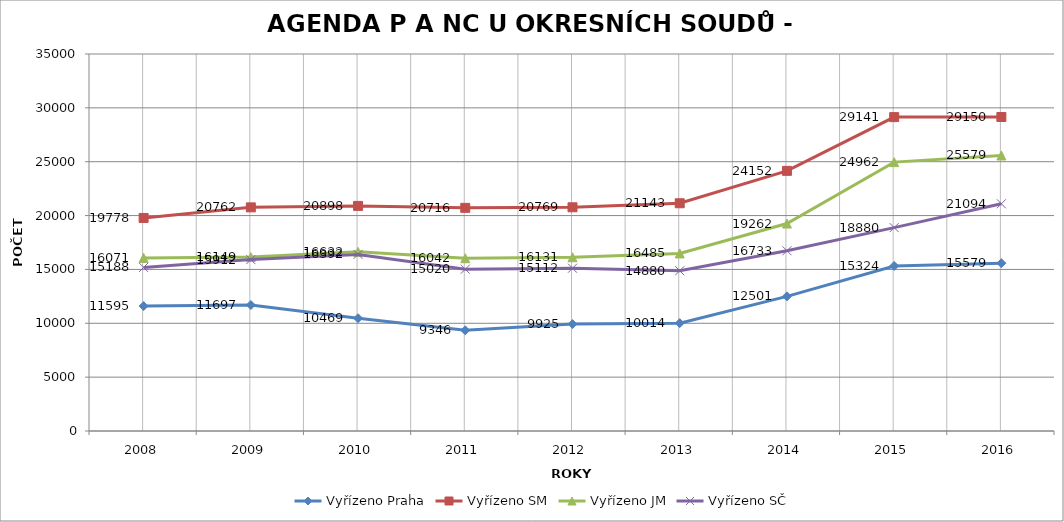
| Category | Vyřízeno Praha | Vyřízeno SM | Vyřízeno JM | Vyřízeno SČ |
|---|---|---|---|---|
| 2008.0 | 11595 | 19778 | 16071 | 15188 |
| 2009.0 | 11697 | 20762 | 16149 | 15912 |
| 2010.0 | 10469 | 20898 | 16632 | 16392 |
| 2011.0 | 9346 | 20716 | 16042 | 15020 |
| 2012.0 | 9925 | 20769 | 16131 | 15112 |
| 2013.0 | 10014 | 21143 | 16485 | 14880 |
| 2014.0 | 12501 | 24152 | 19262 | 16733 |
| 2015.0 | 15324 | 29141 | 24962 | 18880 |
| 2016.0 | 15579 | 29150 | 25579 | 21094 |